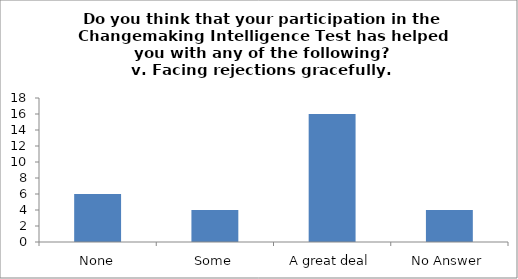
| Category | Do you think that your participation in the Changemaking Intelligence Test has helped you with any of the following?
v. Facing rejections gracefully. |
|---|---|
| None | 6 |
| Some | 4 |
| A great deal | 16 |
| No Answer | 4 |